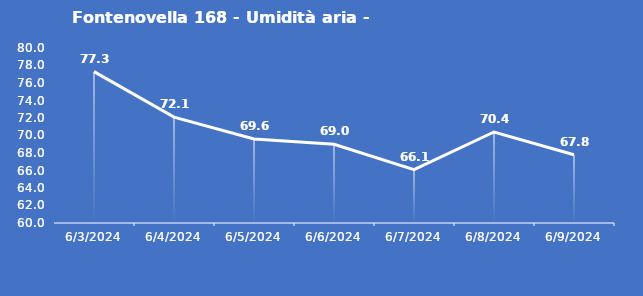
| Category | Fontenovella 168 - Umidità aria - Grezzo (%) |
|---|---|
| 6/3/24 | 77.3 |
| 6/4/24 | 72.1 |
| 6/5/24 | 69.6 |
| 6/6/24 | 69 |
| 6/7/24 | 66.1 |
| 6/8/24 | 70.4 |
| 6/9/24 | 67.8 |